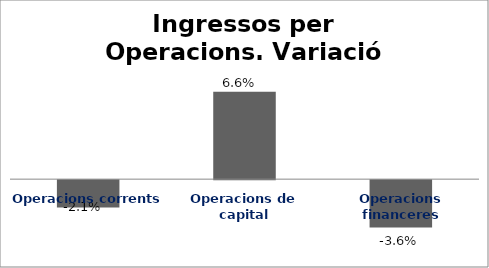
| Category | Series 0 |
|---|---|
| Operacions corrents | -0.021 |
| Operacions de capital | 0.066 |
| Operacions financeres | -0.036 |